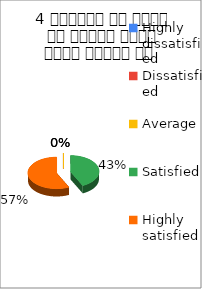
| Category | 4 शिक्षक ने विषय के प्रति रूचि रूचि जागृत की  |
|---|---|
| Highly dissatisfied | 0 |
| Dissatisfied | 0 |
| Average | 0 |
| Satisfied | 3 |
| Highly satisfied | 4 |